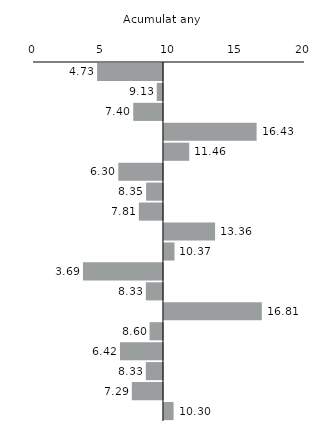
| Category | Series 0 |
|---|---|
| Andalusia | 4.729 |
| Aragó | 9.133 |
| Astúries | 7.4 |
| Balears | 16.428 |
| Canàries | 11.457 |
| Cantàbria | 6.296 |
| Castella i Lleó | 8.348 |
| Castella - la Manxa | 7.811 |
| Catalunya | 13.364 |
| Com. Valenciana | 10.369 |
| Extremadura | 3.688 |
| Galícia | 8.327 |
| Madrid | 16.814 |
| Múrcia | 8.603 |
| Navarra | 6.419 |
| País Basc | 8.325 |
| La Rioja | 7.293 |
| Ceuta i Melilla | 10.3 |